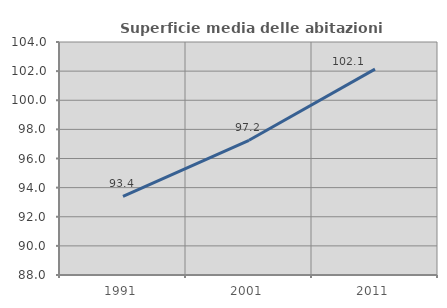
| Category | Superficie media delle abitazioni occupate |
|---|---|
| 1991.0 | 93.402 |
| 2001.0 | 97.248 |
| 2011.0 | 102.137 |